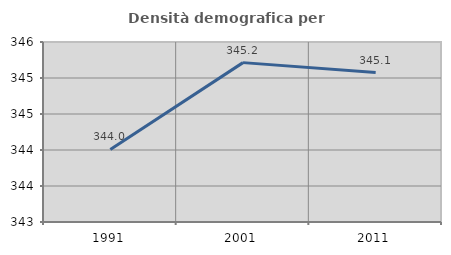
| Category | Densità demografica |
|---|---|
| 1991.0 | 344.007 |
| 2001.0 | 345.214 |
| 2011.0 | 345.075 |